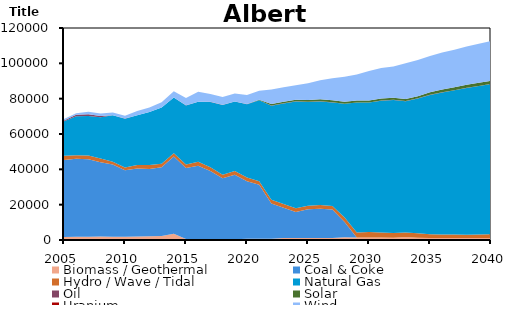
| Category | Biomass / Geothermal | Coal & Coke | Hydro / Wave / Tidal | Natural Gas | Oil | Solar | Uranium | Wind |
|---|---|---|---|---|---|---|---|---|
| 2005.0 | 1725.168 | 43581.072 | 2316 | 19568.76 | 509.437 | 0 | 0 | 741 |
| 2006.0 | 1855.169 | 44117.042 | 1966 | 22063.15 | 860.076 | 0 | 0 | 921 |
| 2007.0 | 1870.362 | 43868.232 | 2113 | 22337.97 | 922.065 | 0 | 0 | 1430 |
| 2008.0 | 1917.388 | 42131.103 | 2150 | 23347.1 | 635.87 | 0 | 0 | 1473 |
| 2009.0 | 1861.5 | 40804.999 | 1695 | 26233.32 | 14.148 | 0 | 0 | 1558 |
| 2010.0 | 1908.777 | 37566.913 | 1620 | 27594.87 | 26.51 | 0 | 0 | 1629 |
| 2011.0 | 1972.19 | 38509.516 | 2036 | 28106.9 | 25.399 | 0 | 0 | 2372 |
| 2012.0 | 2089.118 | 38070.062 | 2319 | 29938.05 | 28.934 | 0 | 0 | 2601 |
| 2013.0 | 2250.1 | 38933.515 | 2028 | 31739.48 | 26.996 | 0 | 0 | 3058 |
| 2014.0 | 3497.7 | 43727.183 | 1821.377 | 31585.45 | 78.409 | 0 | 0 | 3518.866 |
| 2015.0 | 578.191 | 40158.817 | 1977.46 | 33470.38 | 82.745 | 0 | 0 | 4089.32 |
| 2016.0 | 526.039 | 41488.27 | 2281.722 | 33892.11 | 52.462 | 0 | 0 | 5673.607 |
| 2017.0 | 412.404 | 38647.204 | 2061.788 | 37035.11 | 98.554 | 0 | 0 | 4416.643 |
| 2018.0 | 394.243 | 34493.014 | 2061.832 | 39521.06 | 89.957 | 26.28 | 0 | 4416.636 |
| 2019.0 | 394.246 | 36552.454 | 2061.689 | 39341.43 | 89.958 | 26.28 | 0 | 4416.652 |
| 2020.0 | 684.339 | 32576.974 | 2061.747 | 41554.15 | 89.958 | 26.28 | 0 | 5091.557 |
| 2021.0 | 719.379 | 30513.404 | 2061.761 | 45777.36 | 89.958 | 254.04 | 0 | 5091.554 |
| 2022.0 | 719.378 | 19939.614 | 2061.808 | 53283.17 | 89.957 | 954.839 | 0 | 8175.832 |
| 2023.0 | 1157.379 | 17148.904 | 2061.792 | 56887.77 | 90.402 | 954.84 | 0 | 8175.846 |
| 2024.0 | 1157.379 | 14720.414 | 2061.852 | 60459.37 | 89.958 | 954.84 | 0 | 8175.846 |
| 2025.0 | 1157.378 | 16213.904 | 2061.754 | 58663.8 | 89.958 | 1042.44 | 0 | 9451.927 |
| 2026.0 | 1174.898 | 16508.744 | 2061.762 | 58717.49 | 89.958 | 1068.72 | 0 | 10741.13 |
| 2027.0 | 1174.898 | 16039.144 | 2061.766 | 58598.64 | 89.958 | 1068.72 | 0 | 12560.7 |
| 2028.0 | 1612.898 | 8633.954 | 2508.724 | 64311 | 89.957 | 1068.719 | 0 | 14175.6 |
| 2029.0 | 1365.42 | 0 | 2933.575 | 73507.81 | 89.958 | 1068.72 | 0 | 14697.66 |
| 2030.0 | 1353.247 | 0 | 3113.923 | 73308.05 | 89.958 | 1156.321 | 0 | 16647.33 |
| 2031.0 | 1353.243 | 0 | 2826.185 | 74657.2 | 89.958 | 1156.319 | 0 | 17227.24 |
| 2032.0 | 1343.12 | 0 | 2601.224 | 75291.15 | 88.039 | 1157.377 | 0 | 17736.81 |
| 2033.0 | 1637.032 | 0 | 2585.199 | 74333.44 | 85.702 | 1151.694 | 0 | 20224.77 |
| 2034.0 | 1253.823 | 0 | 2557.418 | 76289.38 | 83.956 | 1250.856 | 0 | 20418.39 |
| 2035.0 | 1084.588 | 0 | 2197.08 | 78801.97 | 82.956 | 1462.155 | 0 | 20454.11 |
| 2036.0 | 1082.114 | 0 | 2029.037 | 80423.98 | 82.519 | 1599.099 | 0 | 20955.53 |
| 2037.0 | 1081.492 | 0 | 2027.174 | 81637.31 | 82.41 | 1701.298 | 0 | 21221.63 |
| 2038.0 | 1143.114 | 0 | 1866.366 | 83018.39 | 82.01 | 1716.996 | 0 | 21734.92 |
| 2039.0 | 1145.084 | 0 | 1980.507 | 84026.66 | 82.315 | 1757.968 | 0 | 22120.71 |
| 2040.0 | 1146.486 | 0 | 2190.536 | 84916.98 | 82.533 | 1797.519 | 0 | 22491.62 |